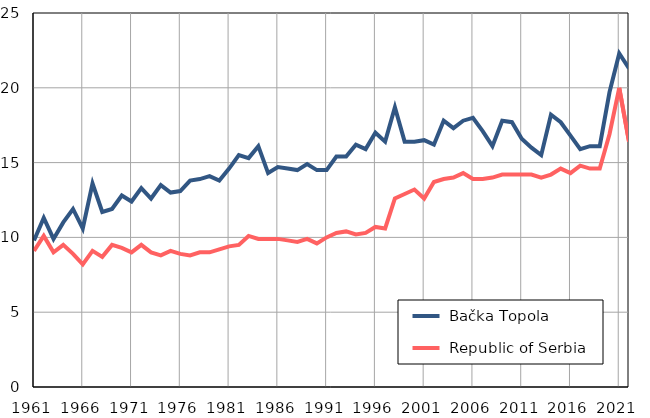
| Category |  Bačka Topola |  Republic of Serbia |
|---|---|---|
| 1961.0 | 9.8 | 9.1 |
| 1962.0 | 11.3 | 10.1 |
| 1963.0 | 9.9 | 9 |
| 1964.0 | 11 | 9.5 |
| 1965.0 | 11.9 | 8.9 |
| 1966.0 | 10.6 | 8.2 |
| 1967.0 | 13.6 | 9.1 |
| 1968.0 | 11.7 | 8.7 |
| 1969.0 | 11.9 | 9.5 |
| 1970.0 | 12.8 | 9.3 |
| 1971.0 | 12.4 | 9 |
| 1972.0 | 13.3 | 9.5 |
| 1973.0 | 12.6 | 9 |
| 1974.0 | 13.5 | 8.8 |
| 1975.0 | 13 | 9.1 |
| 1976.0 | 13.1 | 8.9 |
| 1977.0 | 13.8 | 8.8 |
| 1978.0 | 13.9 | 9 |
| 1979.0 | 14.1 | 9 |
| 1980.0 | 13.8 | 9.2 |
| 1981.0 | 14.6 | 9.4 |
| 1982.0 | 15.5 | 9.5 |
| 1983.0 | 15.3 | 10.1 |
| 1984.0 | 16.1 | 9.9 |
| 1985.0 | 14.3 | 9.9 |
| 1986.0 | 14.7 | 9.9 |
| 1987.0 | 14.6 | 9.8 |
| 1988.0 | 14.5 | 9.7 |
| 1989.0 | 14.9 | 9.9 |
| 1990.0 | 14.5 | 9.6 |
| 1991.0 | 14.5 | 10 |
| 1992.0 | 15.4 | 10.3 |
| 1993.0 | 15.4 | 10.4 |
| 1994.0 | 16.2 | 10.2 |
| 1995.0 | 15.9 | 10.3 |
| 1996.0 | 17 | 10.7 |
| 1997.0 | 16.4 | 10.6 |
| 1998.0 | 18.7 | 12.6 |
| 1999.0 | 16.4 | 12.9 |
| 2000.0 | 16.4 | 13.2 |
| 2001.0 | 16.5 | 12.6 |
| 2002.0 | 16.2 | 13.7 |
| 2003.0 | 17.8 | 13.9 |
| 2004.0 | 17.3 | 14 |
| 2005.0 | 17.8 | 14.3 |
| 2006.0 | 18 | 13.9 |
| 2007.0 | 17.1 | 13.9 |
| 2008.0 | 16.1 | 14 |
| 2009.0 | 17.8 | 14.2 |
| 2010.0 | 17.7 | 14.2 |
| 2011.0 | 16.6 | 14.2 |
| 2012.0 | 16 | 14.2 |
| 2013.0 | 15.5 | 14 |
| 2014.0 | 18.2 | 14.2 |
| 2015.0 | 17.7 | 14.6 |
| 2016.0 | 16.8 | 14.3 |
| 2017.0 | 15.9 | 14.8 |
| 2018.0 | 16.1 | 14.6 |
| 2019.0 | 16.1 | 14.6 |
| 2020.0 | 19.7 | 16.9 |
| 2021.0 | 22.3 | 20 |
| 2022.0 | 21.3 | 16.4 |